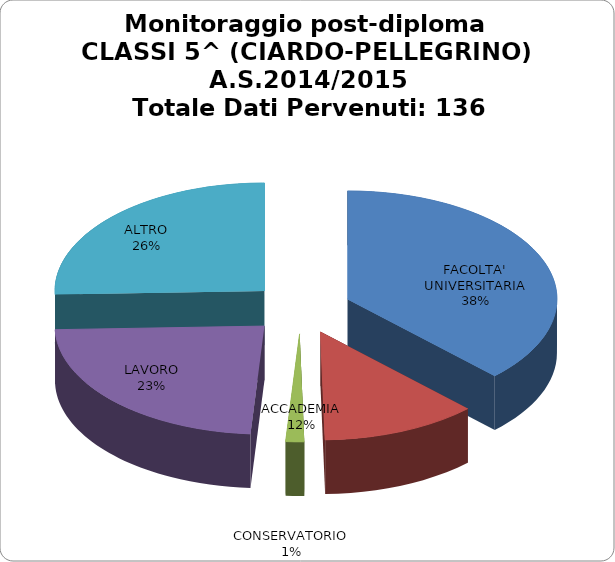
| Category | Series 0 | 37,59% 12,06% 1,42% 23,40% 25,53% |
|---|---|---|
| FACOLTA' UNIVERSITARIA | 0.376 |  |
| ACCADEMIA | 0.121 |  |
| CONSERVATORIO | 0.014 |  |
| LAVORO | 0.234 |  |
| ALTRO | 0.255 |  |